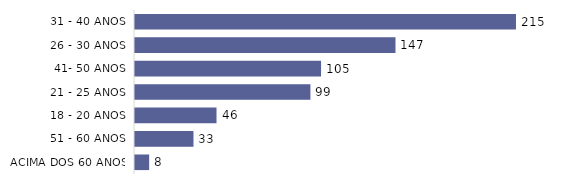
| Category | Total |
|---|---|
| 31 - 40 ANOS | 215 |
| 26 - 30 ANOS | 147 |
| 41- 50 ANOS | 105 |
| 21 - 25 ANOS | 99 |
| 18 - 20 ANOS | 46 |
| 51 - 60 ANOS | 33 |
| ACIMA DOS 60 ANOS | 8 |